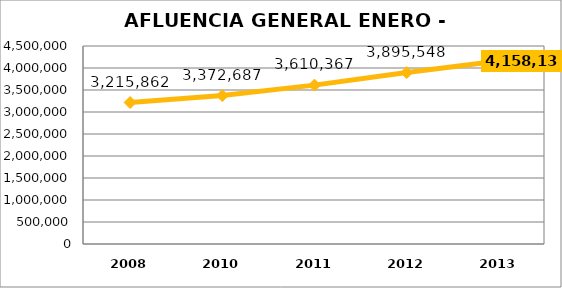
| Category | Series 0 |
|---|---|
| 2008.0 | 3215862 |
| 2010.0 | 3372687 |
| 2011.0 | 3610367 |
| 2012.0 | 3895548 |
| 2013.0 | 4158135 |